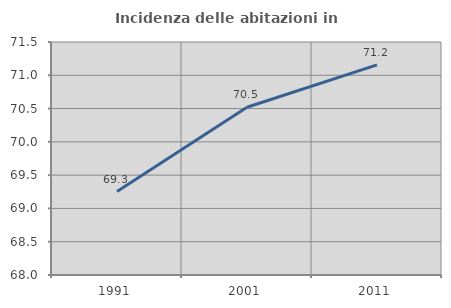
| Category | Incidenza delle abitazioni in proprietà  |
|---|---|
| 1991.0 | 69.253 |
| 2001.0 | 70.519 |
| 2011.0 | 71.156 |